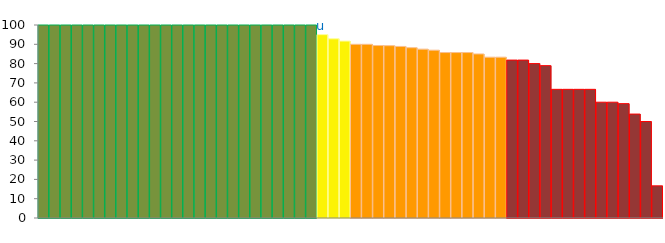
| Category | Top Quartile | 2nd Quartile | 3rd Quartile | Bottom Quartile | Series 4 |
|---|---|---|---|---|---|
|  | 100 | 0 | 0 | 0 | 100 |
|  | 100 | 0 | 0 | 0 | 100 |
|  | 100 | 0 | 0 | 0 | 100 |
|  | 100 | 0 | 0 | 0 | 100 |
|  | 100 | 0 | 0 | 0 | 100 |
|  | 100 | 0 | 0 | 0 | 100 |
|  | 100 | 0 | 0 | 0 | 100 |
|  | 100 | 0 | 0 | 0 | 100 |
|  | 100 | 0 | 0 | 0 | 100 |
|  | 100 | 0 | 0 | 0 | 100 |
|  | 100 | 0 | 0 | 0 | 100 |
|  | 100 | 0 | 0 | 0 | 100 |
|  | 100 | 0 | 0 | 0 | 100 |
|  | 100 | 0 | 0 | 0 | 100 |
|  | 100 | 0 | 0 | 0 | 100 |
|  | 100 | 0 | 0 | 0 | 100 |
|  | 100 | 0 | 0 | 0 | 100 |
|  | 100 | 0 | 0 | 0 | 100 |
|  | 100 | 0 | 0 | 0 | 100 |
|  | 100 | 0 | 0 | 0 | 100 |
|  | 100 | 0 | 0 | 0 | 100 |
|  | 100 | 0 | 0 | 0 | 100 |
|  | 100 | 0 | 0 | 0 | 100 |
|  | 100 | 0 | 0 | 0 | 100 |
|  | 100 | 0 | 0 | 0 | 100 |
| u | 0 | 95 | 0 | 0 | 95 |